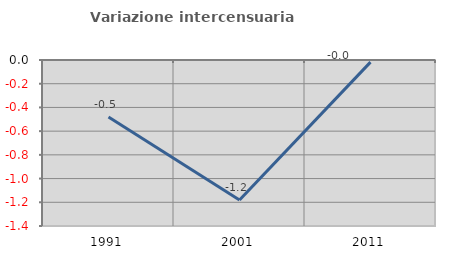
| Category | Variazione intercensuaria annua |
|---|---|
| 1991.0 | -0.481 |
| 2001.0 | -1.18 |
| 2011.0 | -0.018 |